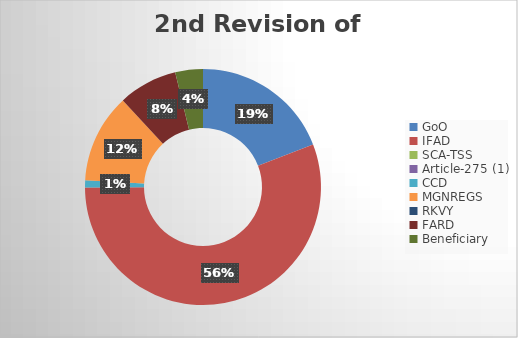
| Category | 2nd Revision of budget  |
|---|---|
| GoO | 188716651.493 |
| IFAD | 550599903.642 |
| SCA-TSS | 0 |
| Article-275 (1) | 0 |
| CCD | 9665000 |
| MGNREGS | 120401800 |
| RKVY | 0 |
| FARD | 79831000 |
| Beneficiary | 37398708.793 |